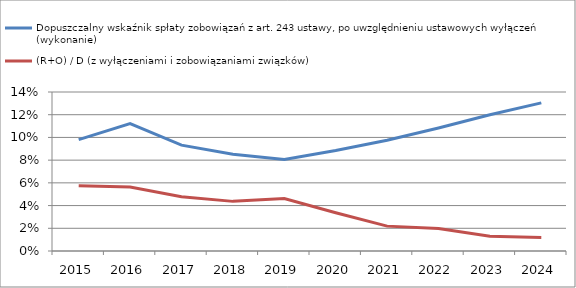
| Category | Dopuszczalny wskaźnik spłaty zobowiązań z art. 243 ustawy, po uwzględnieniu ustawowych wyłączeń (wykonanie)  | (R+O) / D (z wyłączeniami i zobowiązaniami związków) |
|---|---|---|
| 2015.0 | 0.098 | 0.058 |
| 2016.0 | 0.112 | 0.056 |
| 2017.0 | 0.093 | 0.048 |
| 2018.0 | 0.085 | 0.044 |
| 2019.0 | 0.081 | 0.046 |
| 2020.0 | 0.088 | 0.034 |
| 2021.0 | 0.098 | 0.022 |
| 2022.0 | 0.108 | 0.02 |
| 2023.0 | 0.12 | 0.013 |
| 2024.0 | 0.13 | 0.012 |